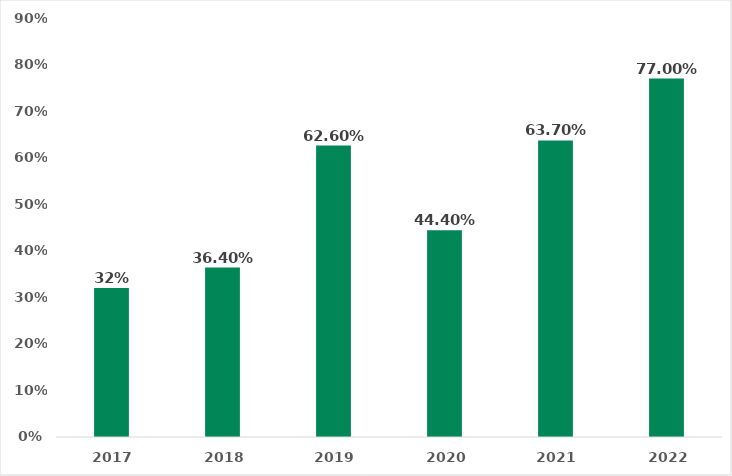
| Category | 32% |
|---|---|
| 2017.0 | 0.32 |
| 2018.0 | 0.364 |
| 2019.0 | 0.626 |
| 2020.0 | 0.444 |
| 2021.0 | 0.637 |
| 2022.0 | 0.77 |